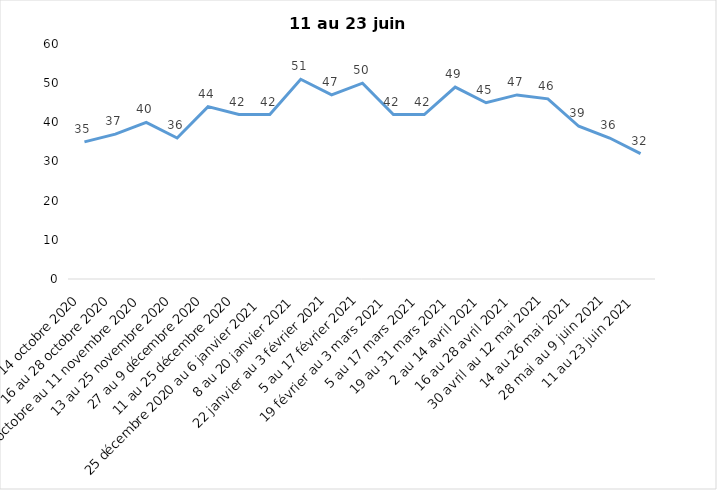
| Category | Toujours aux trois mesures |
|---|---|
| 2 au 14 octobre 2020 | 35 |
| 16 au 28 octobre 2020 | 37 |
| 30 octobre au 11 novembre 2020 | 40 |
| 13 au 25 novembre 2020 | 36 |
| 27 au 9 décembre 2020 | 44 |
| 11 au 25 décembre 2020 | 42 |
| 25 décembre 2020 au 6 janvier 2021 | 42 |
| 8 au 20 janvier 2021 | 51 |
| 22 janvier au 3 février 2021 | 47 |
| 5 au 17 février 2021 | 50 |
| 19 février au 3 mars 2021 | 42 |
| 5 au 17 mars 2021 | 42 |
| 19 au 31 mars 2021 | 49 |
| 2 au 14 avril 2021 | 45 |
| 16 au 28 avril 2021 | 47 |
| 30 avril au 12 mai 2021 | 46 |
| 14 au 26 mai 2021 | 39 |
| 28 mai au 9 juin 2021 | 36 |
| 11 au 23 juin 2021 | 32 |